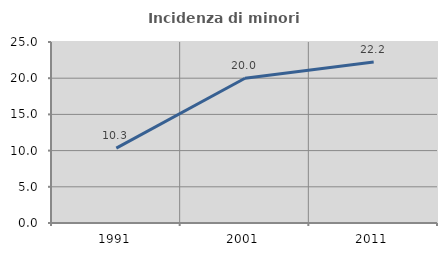
| Category | Incidenza di minori stranieri |
|---|---|
| 1991.0 | 10.345 |
| 2001.0 | 20 |
| 2011.0 | 22.222 |